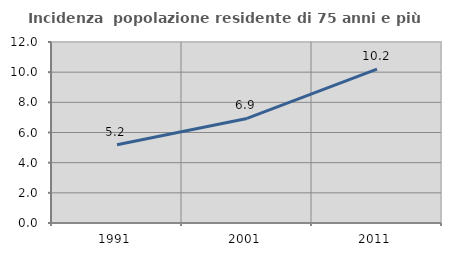
| Category | Incidenza  popolazione residente di 75 anni e più |
|---|---|
| 1991.0 | 5.183 |
| 2001.0 | 6.933 |
| 2011.0 | 10.202 |